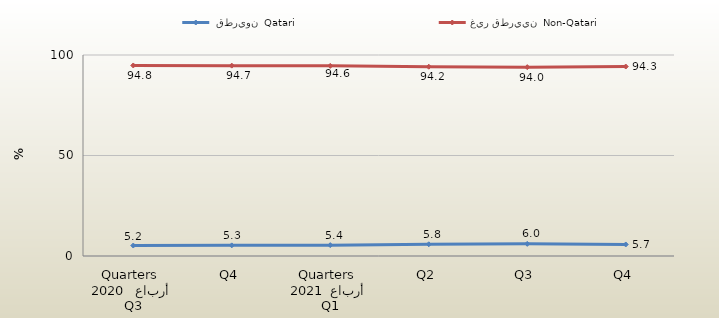
| Category |  قطريون  Qatari | غير قطريين  Non-Qatari |
|---|---|---|
| 0 | 5.214 | 94.786 |
| 1 | 5.293 | 94.707 |
| 2 | 5.404 | 94.596 |
| 3 | 5.836 | 94.164 |
| 4 | 6.047 | 93.953 |
| 5 | 5.737 | 94.263 |